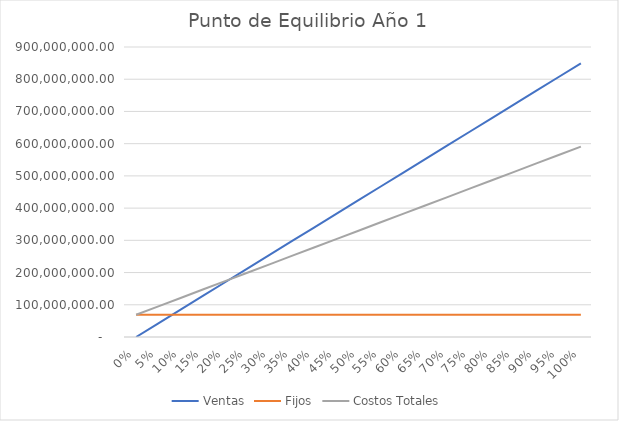
| Category | Ventas | Fijos | Costos Totales |
|---|---|---|---|
| 0.0 | 0 | 68970070.929 | 68970070.929 |
| 0.05 | 42466501 | 68970070.929 | 95064415.458 |
| 0.1 | 84933002 | 68970070.929 | 121158759.987 |
| 0.15 | 127399503 | 68970070.929 | 147253104.516 |
| 0.2 | 169866004 | 68970070.929 | 173347449.046 |
| 0.25 | 212332505 | 68970070.929 | 199441793.575 |
| 0.3 | 254799006 | 68970070.929 | 225536138.104 |
| 0.35 | 297265507 | 68970070.929 | 251630482.633 |
| 0.4 | 339732008 | 68970070.929 | 277724827.162 |
| 0.45 | 382198509 | 68970070.929 | 303819171.691 |
| 0.5 | 424665010 | 68970070.929 | 329913516.221 |
| 0.55 | 467131511 | 68970070.929 | 356007860.75 |
| 0.6 | 509598012 | 68970070.929 | 382102205.279 |
| 0.65 | 552064513 | 68970070.929 | 408196549.808 |
| 0.7 | 594531014 | 68970070.929 | 434290894.337 |
| 0.75 | 636997515 | 68970070.929 | 460385238.867 |
| 0.8 | 679464016 | 68970070.929 | 486479583.396 |
| 0.85 | 721930517 | 68970070.929 | 512573927.925 |
| 0.9 | 764397018 | 68970070.929 | 538668272.454 |
| 0.95 | 806863519 | 68970070.929 | 564762616.983 |
| 1.0 | 849330020 | 68970070.929 | 590856961.512 |